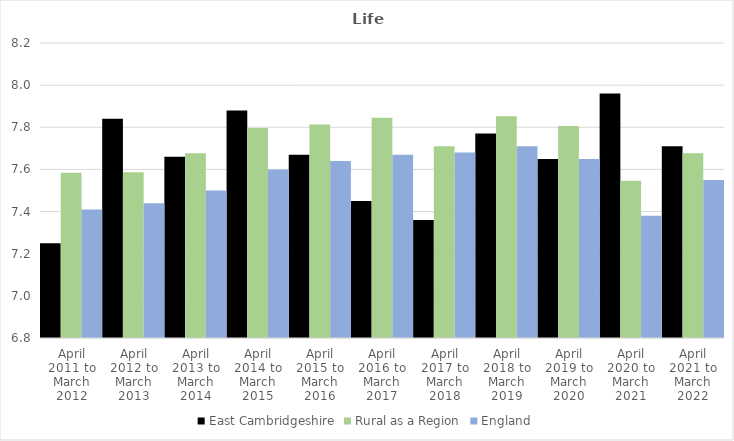
| Category | East Cambridgeshire | Rural as a Region | England |
|---|---|---|---|
| April 2011 to March 2012 | 7.25 | 7.584 | 7.41 |
| April 2012 to March 2013 | 7.84 | 7.586 | 7.44 |
| April 2013 to March 2014 | 7.66 | 7.677 | 7.5 |
| April 2014 to March 2015 | 7.88 | 7.797 | 7.6 |
| April 2015 to March 2016 | 7.67 | 7.813 | 7.64 |
| April 2016 to March 2017 | 7.45 | 7.845 | 7.67 |
| April 2017 to March 2018 | 7.36 | 7.71 | 7.68 |
| April 2018 to March 2019 | 7.77 | 7.852 | 7.71 |
| April 2019 to March 2020 | 7.65 | 7.806 | 7.65 |
| April 2020 to March 2021 | 7.96 | 7.546 | 7.38 |
| April 2021 to March 2022 | 7.71 | 7.677 | 7.55 |